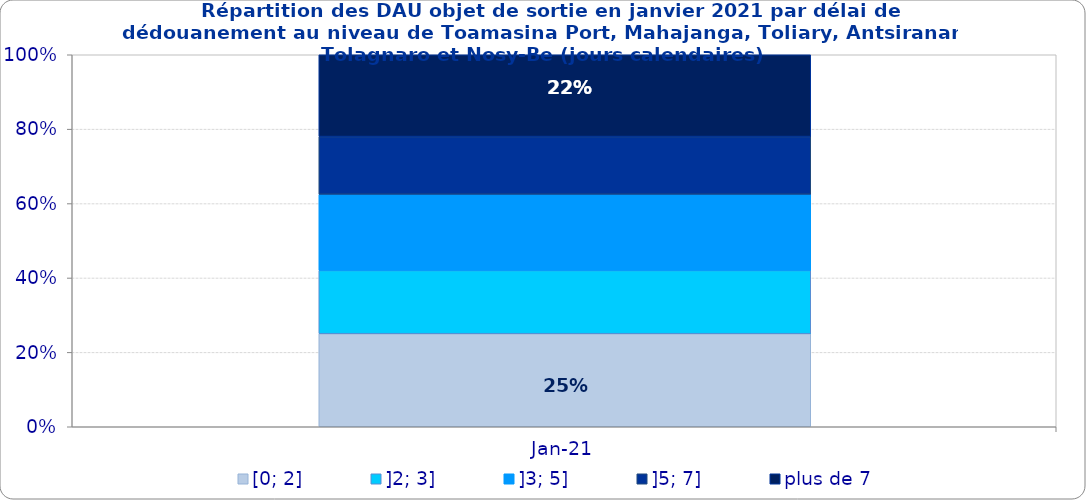
| Category | [0; 2] | ]2; 3] | ]3; 5] | ]5; 7] | plus de 7 |
|---|---|---|---|---|---|
| 2021-01-01 | 0.25 | 0.17 | 0.205 | 0.155 | 0.22 |